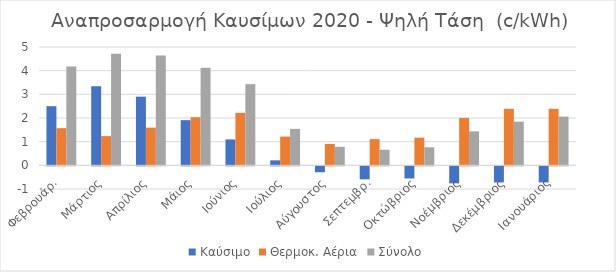
| Category | Καύσιμο | Θερμοκ. Αέρια | Σύνολο |
|---|---|---|---|
| Φεβρουάρ. | 2.499 | 1.57 | 4.178 |
| Μάρτιος | 3.342 | 1.235 | 4.716 |
| Απρίλιος | 2.902 | 1.592 | 4.64 |
| Μάιος | 1.908 | 2.033 | 4.118 |
| Ιούνιος | 1.094 | 2.215 | 3.43 |
| Ιούλιος | 0.211 | 1.214 | 1.541 |
| Αύγουστος | -0.25 | 0.904 | 0.781 |
| Σεπτεμβρ. | -0.55 | 1.106 | 0.658 |
| Οκτώβριος | -0.513 | 1.168 | 0.763 |
| Νοέμβριος | -0.719 | 2.003 | 1.436 |
| Δεκέμβριος | -0.68 | 2.389 | 1.845 |
| Ιανουάριος | -0.68 | 2.389 | 2.059 |